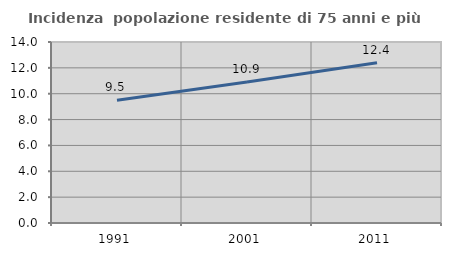
| Category | Incidenza  popolazione residente di 75 anni e più |
|---|---|
| 1991.0 | 9.499 |
| 2001.0 | 10.91 |
| 2011.0 | 12.394 |